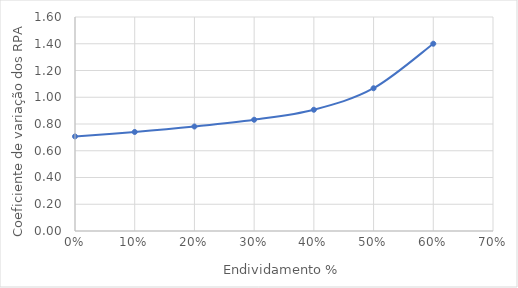
| Category | Coeficiente de variação dos RPA |
|---|---|
| 0.0 | 0.707 |
| 0.1 | 0.74 |
| 0.2 | 0.781 |
| 0.30000000000000004 | 0.832 |
| 0.4 | 0.907 |
| 0.5 | 1.067 |
| 0.6 | 1.4 |